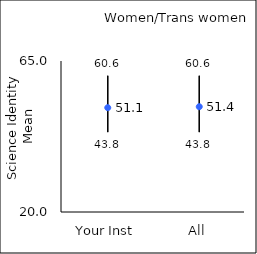
| Category | 25th percentile | 75th percentile | Mean |
|---|---|---|---|
| Your Inst | 43.8 | 60.6 | 51.09 |
| All | 43.8 | 60.6 | 51.38 |